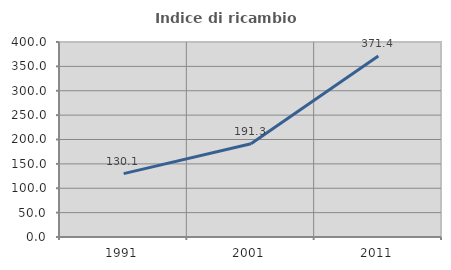
| Category | Indice di ricambio occupazionale  |
|---|---|
| 1991.0 | 130.07 |
| 2001.0 | 191.304 |
| 2011.0 | 371.429 |